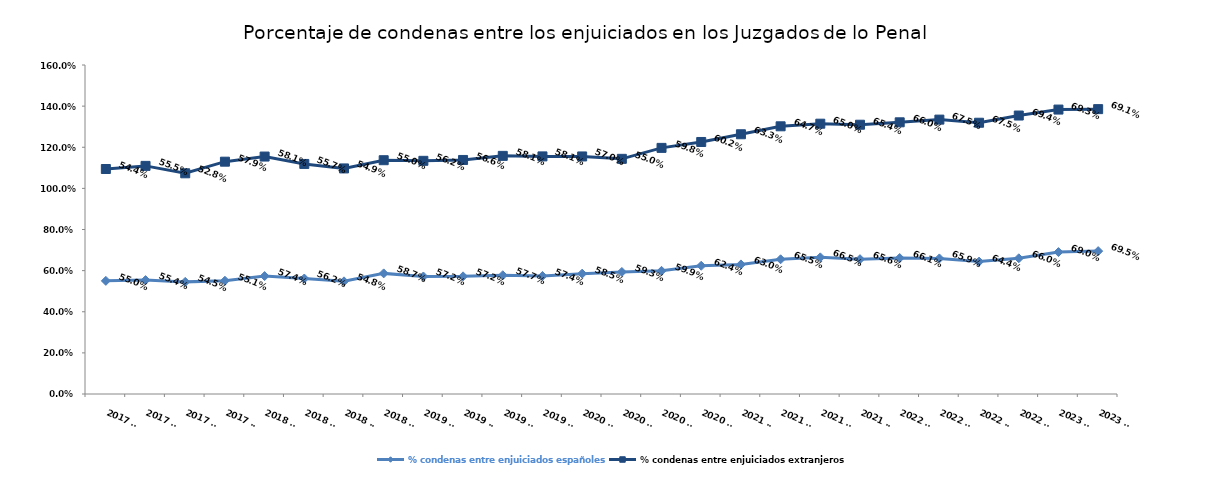
| Category | % condenas entre enjuiciados españoles | % condenas entre enjuiciados extranjeros |
|---|---|---|
| 2017 T1 | 0.55 | 0.544 |
| 2017 T2 | 0.554 | 0.555 |
| 2017 T3 | 0.545 | 0.528 |
| 2017 T4 | 0.551 | 0.579 |
| 2018 T1 | 0.574 | 0.581 |
| 2018 T2 | 0.562 | 0.557 |
| 2018 T3 | 0.548 | 0.549 |
| 2018 T4 | 0.587 | 0.55 |
| 2019 T1 | 0.572 | 0.562 |
| 2019 T2 | 0.572 | 0.566 |
| 2019 T3 | 0.577 | 0.581 |
| 2019 T4 | 0.574 | 0.581 |
| 2020 T1 | 0.585 | 0.57 |
| 2020 T2 | 0.593 | 0.55 |
| 2020 T3 | 0.599 | 0.598 |
| 2020 T4 | 0.624 | 0.602 |
| 2021 T1 | 0.63 | 0.633 |
| 2021 T2 | 0.655 | 0.647 |
| 2021 T3 | 0.665 | 0.65 |
| 2021 T4 | 0.656 | 0.654 |
| 2022 T1 | 0.661 | 0.66 |
| 2022 T2 | 0.659 | 0.675 |
| 2022 T3 | 0.644 | 0.675 |
| 2022 T4 | 0.66 | 0.694 |
| 2023 T1 | 0.69 | 0.693 |
| 2023 T2 | 0.695 | 0.691 |